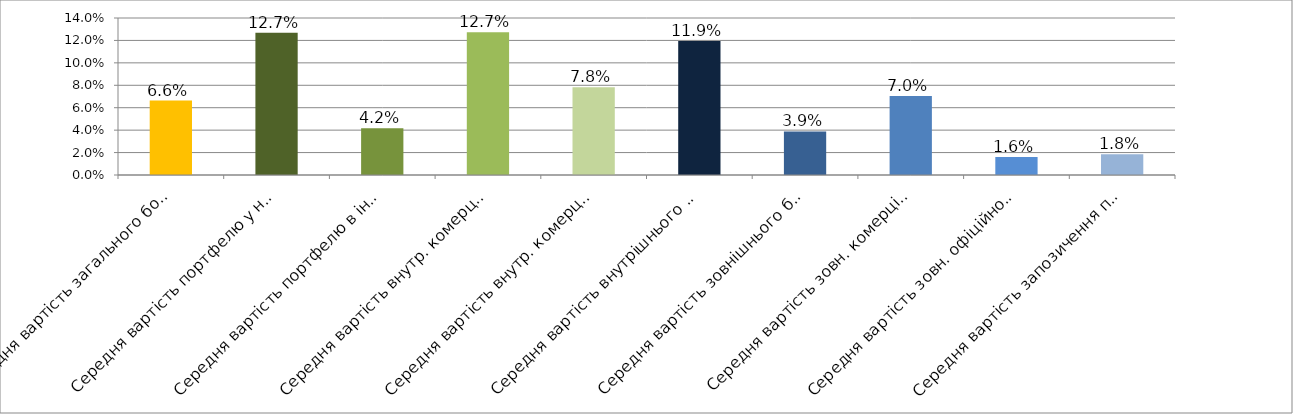
| Category | Series 0 |
|---|---|
| Середня вартість загального боргового портфелю | 0.066 |
| Середня вартість портфелю у нац.валюті | 0.127 |
| Середня вартість портфелю в іноземній валюті | 0.042 |
| Середня вартість внутр. комерційного портфелю в нац.валюті | 0.127 |
| Середня вартість внутр. комерційного портфелю в іноземній валюті | 0.078 |
| Середня вартість внутрішнього боргового портфелю | 0.119 |
| Середня вартість зовнішнього боргового портфелю | 0.039 |
| Середня вартість зовн. комерційного портфелю в іноземній валюті | 0.07 |
| Середня вартість зовн. офіційного портфелю в іноземній валюті | 0.016 |
| Середня вартість запозичення під держгарантії США в іноземній валюті | 0.018 |